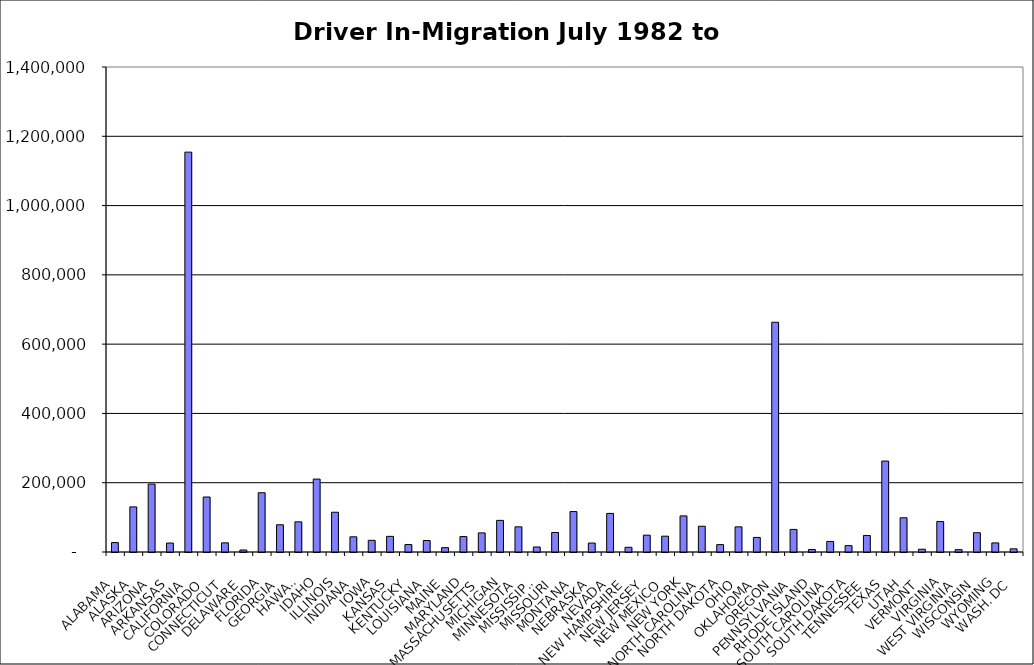
| Category | Series 0 |
|---|---|
| ALABAMA | 27154.5 |
| ALASKA | 130219.5 |
| ARIZONA | 196108 |
| ARKANSAS | 25868.5 |
| CALIFORNIA | 1154269.5 |
| COLORADO | 158730 |
| CONNECTICUT | 26397 |
| DELAWARE | 5792.5 |
| FLORIDA | 171057 |
| GEORGIA | 78616 |
| HAWAII | 87057.5 |
| IDAHO | 210468.5 |
| ILLINOIS | 114751.5 |
| INDIANA | 43824 |
| IOWA | 33696.5 |
| KANSAS | 45105.5 |
| KENTUCKY | 21502 |
| LOUISIANA | 33106.5 |
| MAINE | 12566.5 |
| MARYLAND | 44544 |
| MASSACHUSETTS | 55155 |
| MICHIGAN | 91260 |
| MINNESOTA | 72638.5 |
| MISSISSIPPI | 14449 |
| MISSOURI | 56253 |
| MONTANA | 116711 |
| NEBRASKA | 25876.5 |
| NEVADA | 111425 |
| NEW HAMPSHIRE | 13594.5 |
| NEW JERSEY | 48581 |
| NEW MEXICO | 45655 |
| NEW YORK | 104161 |
| NORTH CAROLINA | 74386.5 |
| NORTH DAKOTA | 21306.5 |
| OHIO | 72573.5 |
| OKLAHOMA | 42052 |
| OREGON | 663120 |
| PENNSYLVANIA | 65203.5 |
| RHODE ISLAND | 7179 |
| SOUTH CAROLINA | 30415.5 |
| SOUTH DAKOTA | 18396.5 |
| TENNESSEE | 47738.5 |
| TEXAS | 262500 |
| UTAH | 98768.5 |
| VERMONT | 8020 |
| VIRGINIA | 87953 |
| WEST VIRGINIA | 6779.5 |
| WISCONSIN | 55680.5 |
| WYOMING | 26243 |
| WASH. DC | 9163 |